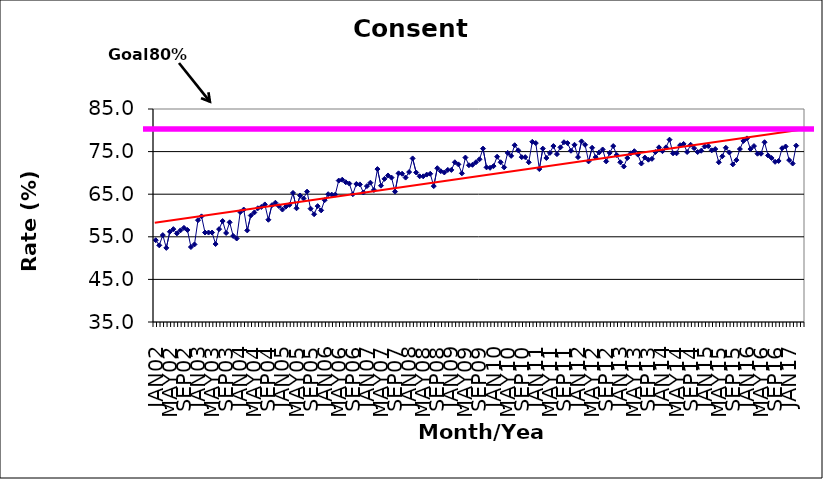
| Category | Series 0 |
|---|---|
| JAN02 | 54.2 |
| FEB02 | 53 |
| MAR02 | 55.4 |
| APR02 | 52.4 |
| MAY02 | 56.2 |
| JUN02 | 56.8 |
| JUL02 | 55.8 |
| AUG02 | 56.5 |
| SEP02 | 57.1 |
| OCT02 | 56.6 |
| NOV02 | 52.6 |
| DEC02 | 53.2 |
| JAN03 | 58.9 |
| FEB03 | 59.8 |
| MAR03 | 56 |
| APR03 | 56 |
| MAY03 | 56 |
| JUN03 | 53.3 |
| JUL03 | 56.8 |
| AUG03 | 58.7 |
| SEP03 | 55.9 |
| OCT03 | 58.4 |
| NOV03 | 55.2 |
| DEC03 | 54.6 |
| JAN04 | 60.8 |
| FEB04 | 61.4 |
| MAR04 | 56.5 |
| APR04 | 60 |
| MAY04 | 60.7 |
| JUN04 | 61.7 |
| JUL04 | 62 |
| AUG04 | 62.6 |
| SEP04 | 59 |
| OCT04 | 62.4 |
| NOV04 | 63 |
| DEC04 | 62.2 |
| JAN05 | 61.4 |
| FEB05 | 62.1 |
| MAR05 | 62.5 |
| APR05 | 65.3 |
| MAY05 | 61.7 |
| JUN05 | 64.7 |
| JUL05 | 64 |
| AUG05 | 65.6 |
| SEP05 | 61.6 |
| OCT05 | 60.3 |
| NOV05 | 62.2 |
| DEC05 | 61.2 |
| JAN06 | 63.6 |
| FEB06 | 65 |
| MAR06 | 64.9 |
| APR06 | 64.9 |
| MAY06 | 68.2 |
| JUN06 | 68.4 |
| JUL06 | 67.8 |
| AUG06 | 67.5 |
| SEP06 | 65 |
| OCT06 | 67.4 |
| NOV06 | 67.3 |
| DEC06 | 65.4 |
| JAN07 | 66.9 |
| FEB07 | 67.7 |
| MAR07 | 66 |
| APR07 | 70.9 |
| MAY07 | 67 |
| JUN07 | 68.6 |
| JUL07 | 69.4 |
| AUG07 | 68.9 |
| SEP07 | 65.6 |
| OCT07 | 69.9 |
| NOV07 | 69.8 |
| DEC07 | 68.9 |
| JAN08 | 70.2 |
| FEB08 | 73.4 |
| MAR08 | 70.1 |
| APR08 | 69.2 |
| MAY08 | 69.2 |
| JUN08 | 69.6 |
| JUL08 | 69.8 |
| AUG08 | 66.9 |
| SEP08 | 71.1 |
| OCT08 | 70.4 |
| NOV08 | 70.1 |
| DEC08 | 70.7 |
| JAN09 | 70.7 |
| FEB09 | 72.5 |
| MAR09 | 72 |
| APR09 | 69.9 |
| MAY09 | 73.6 |
| JUN09 | 71.8 |
| JUL09 | 71.9 |
| AUG09 | 72.5 |
| SEP09 | 73.2 |
| OCT09 | 75.7 |
| NOV09 | 71.3 |
| DEC09 | 71.2 |
| JAN10 | 71.6 |
| FEB10 | 73.8 |
| MAR10 | 72.5 |
| APR10 | 71.3 |
| MAY10 | 74.7 |
| JUN10 | 74 |
| JUL10 | 76.5 |
| AUG10 | 75.3 |
| SEP10 | 73.7 |
| OCT10 | 73.7 |
| NOV10 | 72.5 |
| DEC10 | 77.3 |
| JAN11 | 77 |
| FEB11 | 70.9 |
| MAR11 | 75.7 |
| APR11 | 73.5 |
| MAY11 | 74.7 |
| JUN11 | 76.3 |
| JUL11 | 74.4 |
| AUG11 | 76 |
| SEP11 | 77.2 |
| OCT11 | 77 |
| NOV11 | 75.2 |
| DEC11 | 76.6 |
| JAN12 | 73.7 |
| FEB12 | 77.4 |
| MAR12 | 76.6 |
| APR12 | 72.7 |
| MAY12 | 75.9 |
| JUN12 | 73.7 |
| JUL12 | 74.8 |
| AUG12 | 75.5 |
| SEP12 | 72.7 |
| OCT12 | 74.7 |
| NOV12 | 76.3 |
| DEC12 | 74.2 |
| JAN13 | 72.5 |
| FEB13 | 71.5 |
| MAR13 | 73.5 |
| APR13 | 74.6 |
| MAY13 | 75.1 |
| JUN13 | 74.3 |
| JUL13 | 72.2 |
| AUG13 | 73.6 |
| SEP13 | 73.1 |
| OCT13 | 73.3 |
| NOV13 | 74.9 |
| DEC13 | 76 |
| JAN14 | 75.1 |
| FEB14 | 76 |
| MAR14 | 77.8 |
| APR14 | 74.6 |
| MAY14 | 74.6 |
| JUN14 | 76.5 |
| JUL14 | 76.8 |
| AUG14 | 74.9 |
| SEP14 | 76.6 |
| OCT14 | 75.8 |
| NOV14 | 74.9 |
| DEC14 | 75.2 |
| JAN15 | 76.2 |
| FEB15 | 76.3 |
| MAR15 | 75.3 |
| APR15 | 75.6 |
| MAY15 | 72.5 |
| JUN15 | 73.9 |
| JUL15 | 75.9 |
| AUG15 | 74.8 |
| SEP15 | 72 |
| OCT15 | 73 |
| NOV15 | 75.6 |
| DEC15 | 77.5 |
| JAN16 | 78.1 |
| FEB16 | 75.6 |
| MAR16 | 76.3 |
| APR16 | 74.5 |
| MAY16 | 74.5 |
| JUN16 | 77.2 |
| JUL16 | 74.1 |
| AUG16 | 73.5 |
| SEP16 | 72.6 |
| OCT16 | 72.8 |
| NOV16 | 75.8 |
| DEC16 | 76.2 |
| JAN17 | 73 |
| FEB17 | 72.2 |
| MAR17 | 76.4 |